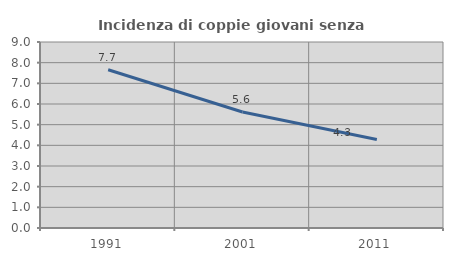
| Category | Incidenza di coppie giovani senza figli |
|---|---|
| 1991.0 | 7.656 |
| 2001.0 | 5.611 |
| 2011.0 | 4.283 |